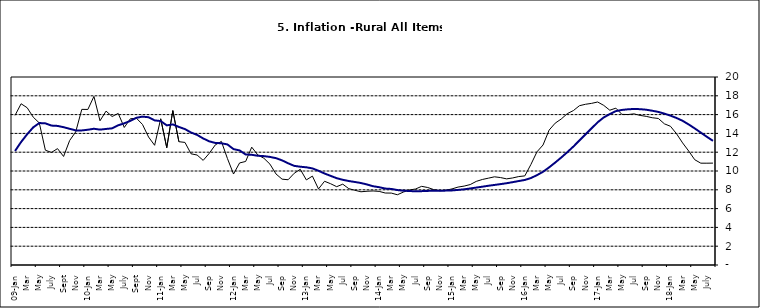
| Category | Series 0 | Series 1 |
|---|---|---|
| 09-Jan | 15.918 | 12.128 |
| Feb | 17.154 | 13.086 |
| Mar | 16.729 | 13.912 |
| Apr | 15.727 | 14.644 |
| May | 15.113 | 15.104 |
| June | 12.213 | 15.067 |
| July | 11.974 | 14.832 |
| Aug | 12.38 | 14.796 |
| Sept | 11.548 | 14.661 |
| Oct | 13.242 | 14.488 |
| Nov | 14.164 | 14.321 |
|  | 16.557 | 14.316 |
| 10-Jan | 16.548 | 14.39 |
| Feb | 17.934 | 14.494 |
| Mar | 15.346 | 14.401 |
| Apr | 16.373 | 14.473 |
| May | 15.794 | 14.54 |
| June | 16.126 | 14.862 |
| July | 14.634 | 15.072 |
| Aug | 15.556 | 15.33 |
| Sept | 15.616 | 15.658 |
| Oct | 14.955 | 15.786 |
| Nov | 13.616 | 15.719 |
| Dec | 12.735 | 15.385 |
| 11-Jan | 15.553 | 15.311 |
| Feb | 12.482 | 14.856 |
| Mar | 16.422 | 14.956 |
| Apr | 13.117 | 14.687 |
| May | 13.041 | 14.457 |
| Jun | 11.83 | 14.095 |
| Jul | 11.699 | 13.84 |
| Aug | 11.13 | 13.464 |
| Sep | 11.878 | 13.156 |
| Oct | 12.778 | 12.985 |
| Nov | 13.147 | 12.95 |
| Dec | 11.326 | 12.824 |
| 12-Jan | 9.678 | 12.33 |
| Feb | 10.856 | 12.188 |
| Mar | 11.014 | 11.76 |
| Apr | 12.536 | 11.724 |
| May | 11.712 | 11.621 |
| Jun | 11.36 | 11.582 |
| Jul | 10.733 | 11.499 |
| Aug | 9.683 | 11.368 |
| Sep | 9.132 | 11.131 |
| Oct | 9.071 | 10.82 |
| Nov | 9.758 | 10.548 |
| Dec | 10.183 | 10.455 |
| 13-Jan | 9.052 | 10.394 |
| Feb | 9.457 | 10.276 |
| Mar | 8.091 | 10.025 |
| Apr | 8.907 | 9.732 |
| May | 8.647 | 9.483 |
| Jun | 8.333 | 9.236 |
| Jul | 8.6 | 9.063 |
| Aug | 8.12 | 8.933 |
| Sep | 7.95 | 8.832 |
| Oct | 7.791 | 8.722 |
| Nov | 7.849 | 8.565 |
| Dec | 7.879 | 8.378 |
| 14-Jan | 7.832 | 8.277 |
| Feb | 7.657 | 8.13 |
| Mar | 7.65 | 8.092 |
| Apr | 7.473 | 7.973 |
| May | 7.761 | 7.901 |
| Jun | 7.98 | 7.874 |
| Jul | 8.086 | 7.834 |
| Aug | 8.368 | 7.858 |
| Sep | 8.244 | 7.883 |
| Oct | 8.019 | 7.903 |
| Nov | 7.898 | 7.906 |
| Dec | 7.955 | 7.913 |
| 15-Jan | 8.094 | 7.935 |
| Feb | 8.291 | 7.988 |
| Mar | 8.396 | 8.05 |
| Apr | 8.556 | 8.14 |
| May | 8.896 | 8.236 |
| Jun | 9.098 | 8.331 |
| Jul | 9.238 | 8.429 |
| Aug | 9.382 | 8.516 |
| Sep | 9.3 | 8.606 |
| Oct | 9.162 | 8.7 |
| Nov | 9.261 | 8.813 |
| Dec | 9.41 | 8.933 |
| 16-Jan | 9.48 | 9.047 |
| Feb | 10.692 | 9.249 |
| Mar | 12.038 | 9.559 |
| Apr | 12.767 | 9.917 |
| May | 14.349 | 10.384 |
| Jun | 15.088 | 10.897 |
| Jul | 15.533 | 11.433 |
| Aug | 16.103 | 12.002 |
| Sep | 16.428 | 12.601 |
| Oct | 16.947 | 13.25 |
| Nov | 17.099 | 13.898 |
| Dec | 17.195 | 14.54 |
| 17-Jan | 17.341 | 15.183 |
| Feb | 16.982 | 15.696 |
| Mar | 16.466 | 16.054 |
| Apr | 16.687 | 16.369 |
| May | 16.023 | 16.497 |
| Jun | 16.007 | 16.563 |
| Jul | 16.078 | 16.6 |
| Aug | 15.914 | 16.577 |
| Sep | 15.812 | 16.52 |
| Oct | 15.666 | 16.411 |
| Nov | 15.587 | 16.285 |
| Dec | 15.018 | 16.104 |
| 18-Jan | 14.756 | 15.892 |
| Feb | 13.957 | 15.638 |
| Mar | 12.987 | 15.339 |
| Apr | 12.126 | 14.95 |
| May | 11.199 | 14.53 |
| June | 10.832 | 14.083 |
| July | 10.831 | 13.636 |
| August | 10.838 | 13.209 |